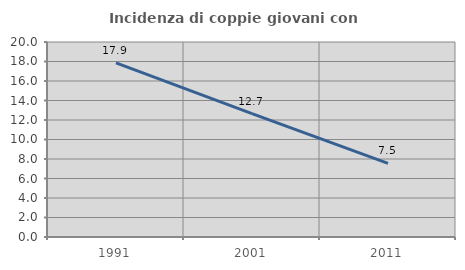
| Category | Incidenza di coppie giovani con figli |
|---|---|
| 1991.0 | 17.853 |
| 2001.0 | 12.663 |
| 2011.0 | 7.547 |